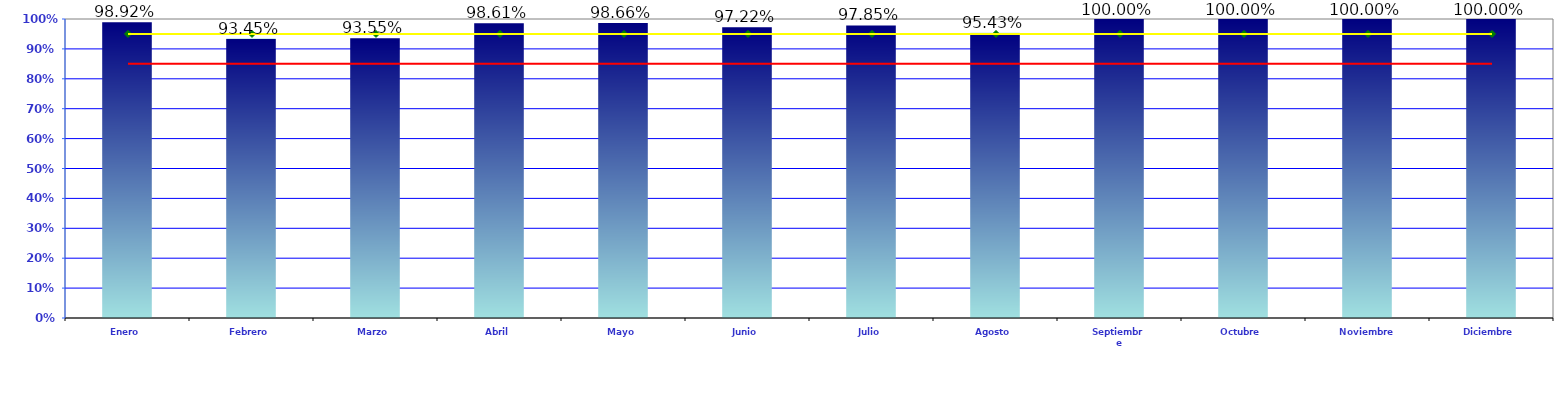
| Category | LOGROS |
|---|---|
| Enero | 0.989 |
| Febrero | 0.935 |
| Marzo | 0.935 |
| Abril | 0.986 |
| Mayo | 0.987 |
| Junio | 0.972 |
| Julio | 0.978 |
| Agosto | 0.954 |
| Septiembre | 1 |
| Octubre | 1 |
| Noviembre | 1 |
| Diciembre | 1 |